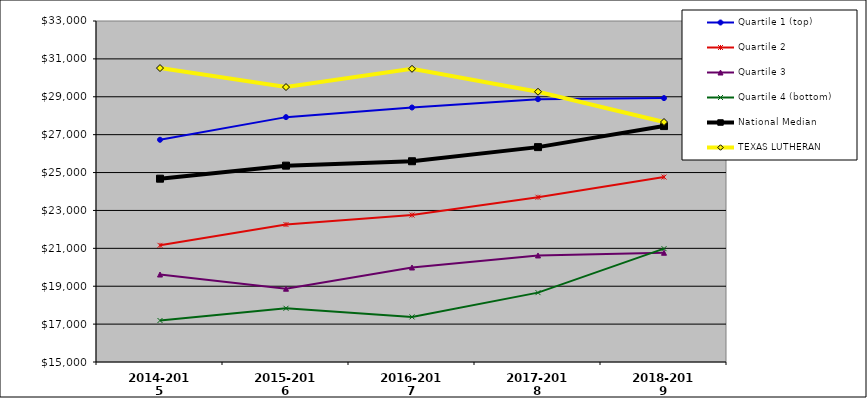
| Category | Quartile 1 (top) | Quartile 2 | Quartile 3 | Quartile 4 (bottom) | National Median | TEXAS LUTHERAN |
|---|---|---|---|---|---|---|
| 2014-2015 | 26730.663 | 21157.901 | 19617.506 | 17189.867 | 24676.206 | 30515.957 |
| 2015-2016 | 27925.582 | 22254.723 | 18868.378 | 17835.71 | 25364.205 | 29513.209 |
| 2016-2017 | 28434.071 | 22756.644 | 19988.875 | 17381.538 | 25597.574 | 30475.146 |
| 2017-2018 | 28872.581 | 23696.52 | 20624.048 | 18661.61 | 26342.841 | 29264.768 |
| 2018-2019 | 28929.772 | 24763.107 | 20767.536 | 20983.377 | 27452.913 | 27668.054 |